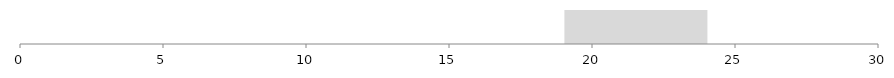
| Category | Series 0 | Series 1 |
|---|---|---|
| 0 | 24 | 19 |